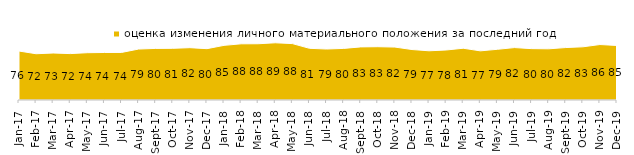
| Category | оценка изменения личного материального положения за последний год |
|---|---|
| 2017-01-01 | 76.3 |
| 2017-02-01 | 72.1 |
| 2017-03-01 | 73.2 |
| 2017-04-01 | 72.3 |
| 2017-05-01 | 73.7 |
| 2017-06-01 | 74.05 |
| 2017-07-01 | 74.1 |
| 2017-08-01 | 79.4 |
| 2017-09-01 | 80.4 |
| 2017-10-01 | 80.55 |
| 2017-11-01 | 81.55 |
| 2017-12-01 | 80 |
| 2018-01-01 | 85.15 |
| 2018-02-01 | 87.55 |
| 2018-03-01 | 87.65 |
| 2018-04-01 | 89.15 |
| 2018-05-01 | 87.9 |
| 2018-06-01 | 80.55 |
| 2018-07-01 | 79.45 |
| 2018-08-01 | 80.4 |
| 2018-09-01 | 82.75 |
| 2018-10-01 | 83.05 |
| 2018-11-01 | 82.485 |
| 2018-12-01 | 78.65 |
| 2019-01-01 | 76.7 |
| 2019-02-01 | 77.9 |
| 2019-03-01 | 80.656 |
| 2019-04-01 | 76.584 |
| 2019-05-01 | 79 |
| 2019-06-01 | 81.696 |
| 2019-07-01 | 80.05 |
| 2019-08-01 | 79.77 |
| 2019-09-01 | 81.733 |
| 2019-10-01 | 82.871 |
| 2019-11-01 | 86.436 |
| 2019-12-01 | 85 |